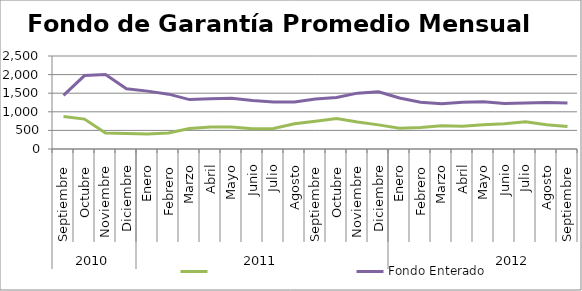
| Category | Series 2 | Fondo Enterado |
|---|---|---|
| 0 | 871.43 | 1439.553 |
| 1 | 804.208 | 1973.732 |
| 2 | 428.758 | 2004.096 |
| 3 | 417.974 | 1620.905 |
| 4 | 403.651 | 1555.632 |
| 5 | 429.02 | 1474.054 |
| 6 | 551.344 | 1328.521 |
| 7 | 591.732 | 1351.463 |
| 8 | 591.784 | 1363.301 |
| 9 | 544.875 | 1304.985 |
| 10 | 551.606 | 1265.502 |
| 11 | 679.839 | 1266.018 |
| 12 | 747.74 | 1344.929 |
| 13 | 819.75 | 1383.171 |
| 14 | 723.635 | 1501.378 |
| 15 | 648.288 | 1537.485 |
| 16 | 560.173 | 1370.992 |
| 17 | 575.916 | 1258.831 |
| 18 | 622.075 | 1216.471 |
| 19 | 612.299 | 1258.963 |
| 20 | 654.277 | 1273.362 |
| 21 | 675.965 | 1225.977 |
| 22 | 729.97 | 1235.91 |
| 23 | 649.095 | 1253.333 |
| 24 | 606.03 | 1237.548 |